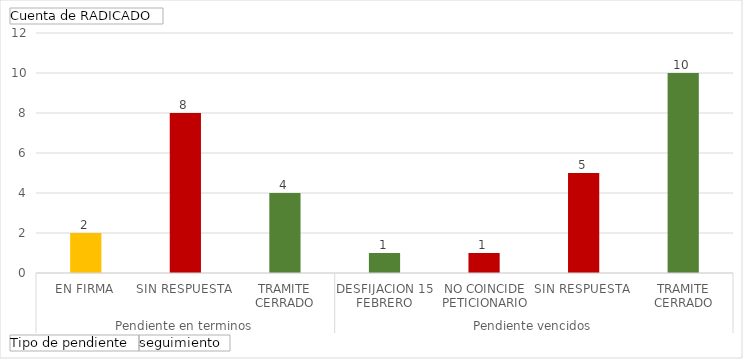
| Category | Total |
|---|---|
| 0 | 2 |
| 1 | 8 |
| 2 | 4 |
| 3 | 1 |
| 4 | 1 |
| 5 | 5 |
| 6 | 10 |